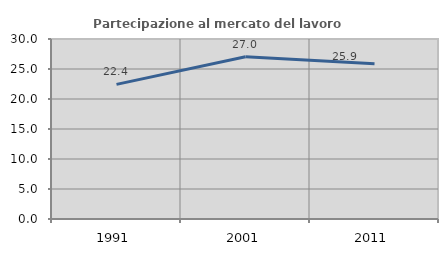
| Category | Partecipazione al mercato del lavoro  femminile |
|---|---|
| 1991.0 | 22.44 |
| 2001.0 | 27.041 |
| 2011.0 | 25.88 |